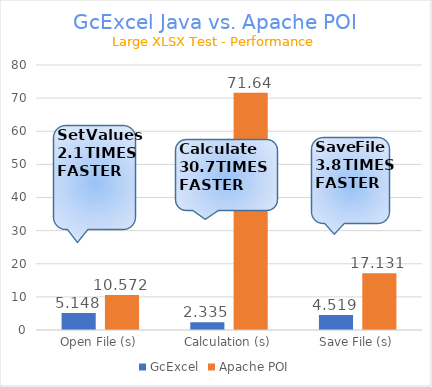
| Category | GcExcel | Apache POI |
|---|---|---|
| Open File (s) | 5.148 | 10.572 |
| Calculation (s) | 2.335 | 71.64 |
| Save File (s) | 4.519 | 17.131 |